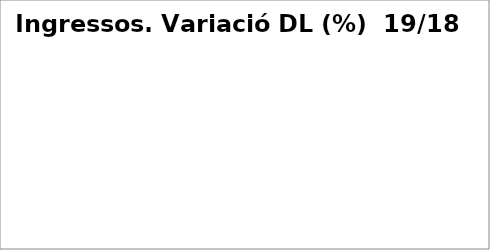
| Category | Series 0 |
|---|---|
| Impostos directes | 0.098 |
| Impostos indirectes | 0.366 |
| Taxes, preus públics i altres ingressos | 0.291 |
| Transferències corrents | 0.047 |
| Ingressos patrimonials | 0.222 |
| Venda d'inversions reals | -1 |
| Transferències de capital | 0 |
| Actius financers* | 0 |
| Passius financers | -0.734 |